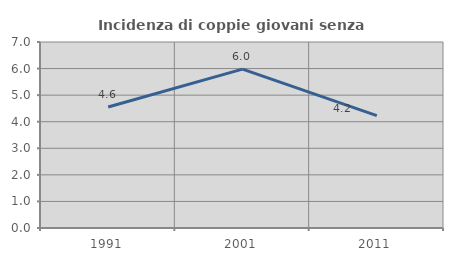
| Category | Incidenza di coppie giovani senza figli |
|---|---|
| 1991.0 | 4.556 |
| 2001.0 | 5.978 |
| 2011.0 | 4.227 |